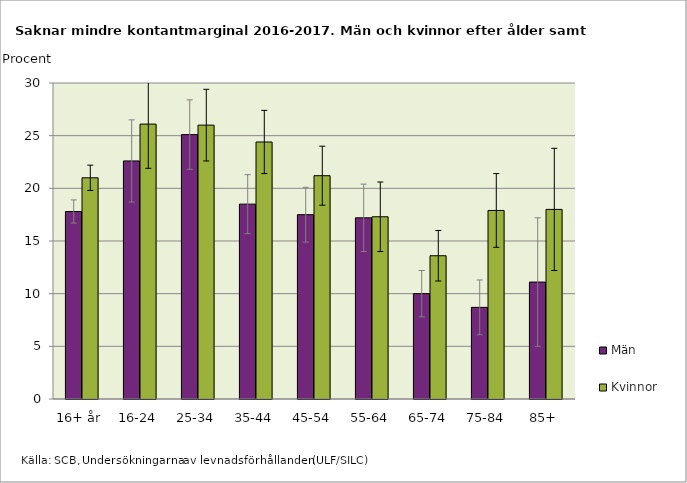
| Category | Män | Kvinnor |
|---|---|---|
| 16+ år | 17.8 | 21 |
| 16-24 | 22.6 | 26.1 |
| 25-34 | 25.1 | 26 |
| 35-44 | 18.5 | 24.4 |
| 45-54 | 17.5 | 21.2 |
| 55-64 | 17.2 | 17.3 |
| 65-74 | 10 | 13.6 |
| 75-84 | 8.7 | 17.9 |
| 85+ | 11.1 | 18 |